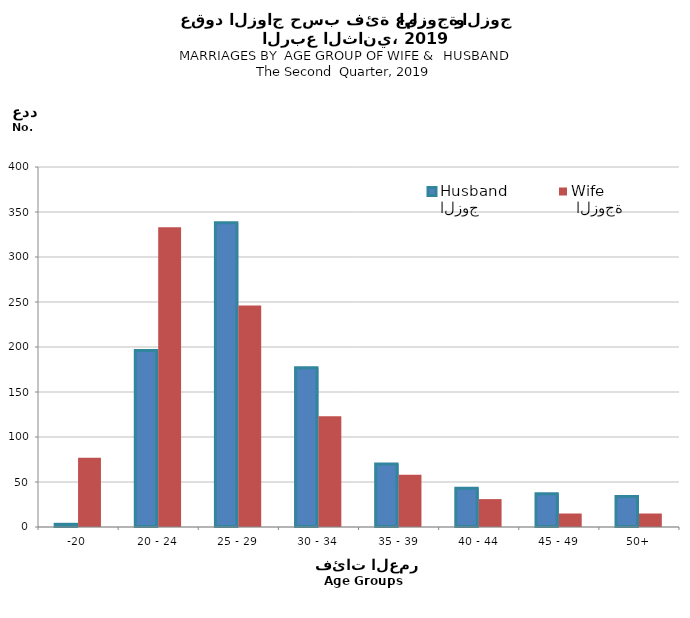
| Category | الزوج
Husband |  الزوجة
Wife |
|---|---|---|
| -20 | 3 | 77 |
| 20 - 24 | 196 | 333 |
| 25 - 29 | 338 | 246 |
| 30 - 34 | 177 | 123 |
| 35 - 39 | 70 | 58 |
| 40 - 44 | 43 | 31 |
| 45 - 49 | 37 | 15 |
| 50+ | 34 | 15 |